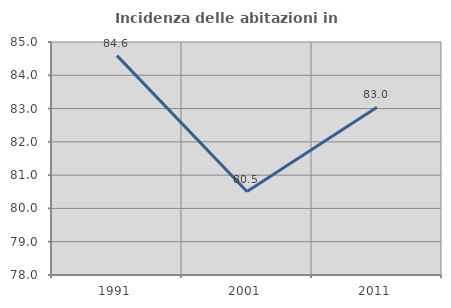
| Category | Incidenza delle abitazioni in proprietà  |
|---|---|
| 1991.0 | 84.591 |
| 2001.0 | 80.506 |
| 2011.0 | 83.042 |